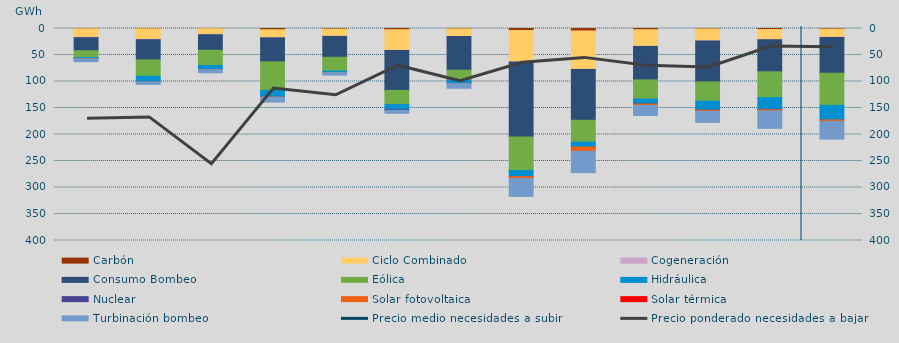
| Category | Carbón | Ciclo Combinado | Cogeneración | Consumo Bombeo | Eólica | Hidráulica | Nuclear | Solar fotovoltaica | Solar térmica | Turbinación bombeo |
|---|---|---|---|---|---|---|---|---|---|---|
| 0 | 431.9 | 16303.5 | 603.6 | 24652 | 12996.3 | 2005.4 | 25 | 151.9 | 0 | 5443.1 |
| 1 | 587 | 19880.3 | 745.7 | 38129.4 | 30707.4 | 11038.8 | 0 | 83.9 | 0 | 4346.7 |
| 2 | 318.1 | 10959 | 432 | 29416 | 28648.7 | 7863.5 | 0 | 105 | 0 | 5723.9 |
| 3 | 2349.7 | 14809.8 | 513.2 | 45318.9 | 53811.9 | 12435.2 | 162.7 | 147 | 0 | 9302.2 |
| 4 | 1032.05 | 13586.525 | 372.15 | 39287.3 | 26177.05 | 2674.925 | 0 | 91.5 | 0 | 4779.4 |
| 5 | 2338.05 | 38734.9 | 425.275 | 75366.15 | 26713.775 | 10087.325 | 758.925 | 314.05 | 0 | 5208.05 |
| 6 | 607 | 14346.825 | 84.1 | 63631.75 | 18608.375 | 6324.8 | 376.5 | 124.625 | 0 | 8670.125 |
| 7 | 3747 | 59427.025 | 92.6 | 141431.55 | 63317 | 11208.6 | 225.6 | 3390.725 | 0 | 34005.35 |
| 8 | 4777.9 | 72027.575 | 369 | 96009.825 | 41297.175 | 9161.725 | 0 | 8173.5 | 0 | 40164.95 |
| 9 | 2339.95 | 31212.45 | 309 | 63146.125 | 35992.6 | 9536.075 | 20 | 2519.6 | 0 | 19037.975 |
| 10 | 804 | 22741.325 | 259.55 | 76959.4 | 36430.1 | 16893 | 82 | 2101.325 | 0 | 20947.55 |
| 11 | 1954 | 18792.9 | 569.425 | 60395.65 | 48803.7 | 22168.6 | 540.725 | 2191.975 | 0 | 32969.35 |
| 12 | 1013 | 15498.975 | 284.05 | 67580.25 | 60658.55 | 27501.4 | 0 | 2682.825 | 0 | 33526.625 |